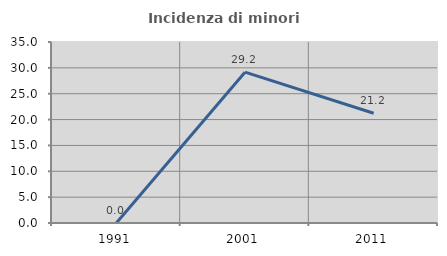
| Category | Incidenza di minori stranieri |
|---|---|
| 1991.0 | 0 |
| 2001.0 | 29.167 |
| 2011.0 | 21.212 |